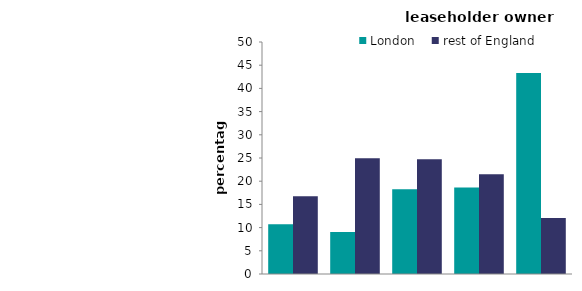
| Category | London | rest of England |
|---|---|---|
| first quintile (lowest) | 10.712 | 16.78 |
| second quintile | 9.041 | 24.935 |
| third quintile | 18.252 | 24.711 |
| fourth quintile | 18.662 | 21.509 |
| fifth quintile (highest) | 43.333 | 12.065 |